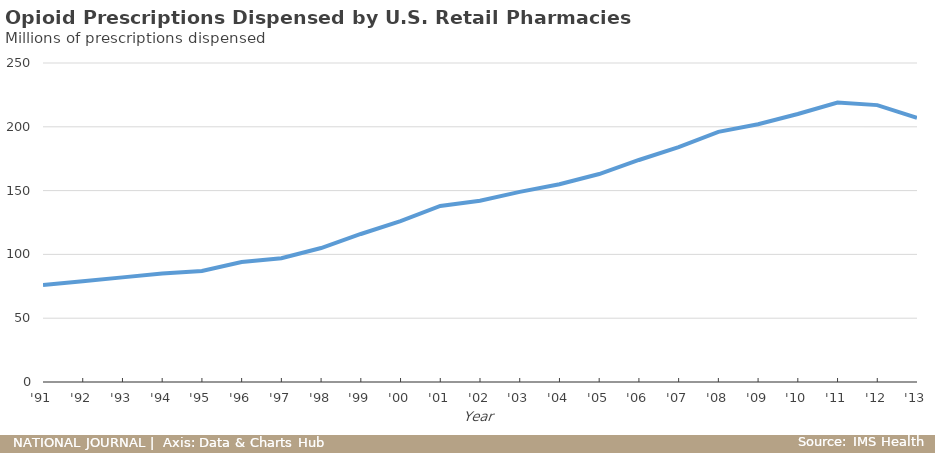
| Category | Opioid Prescriptions (millions) |
|---|---|
| 1991-01-01 | 76 |
| 1992-01-01 | 79 |
| 1993-01-01 | 82 |
| 1994-01-01 | 85 |
| 1995-01-01 | 87 |
| 1996-01-01 | 94 |
| 1997-01-01 | 97 |
| 1998-01-01 | 105 |
| 1999-01-01 | 116 |
| 2000-01-01 | 126 |
| 2001-01-01 | 138 |
| 2002-01-01 | 142 |
| 2003-01-01 | 149 |
| 2004-01-01 | 155 |
| 2005-01-01 | 163 |
| 2006-01-01 | 174 |
| 2007-01-01 | 184 |
| 2008-01-01 | 196 |
| 2009-01-01 | 202 |
| 2010-01-01 | 210 |
| 2011-01-01 | 219 |
| 2012-01-01 | 217 |
| 2013-01-01 | 207 |